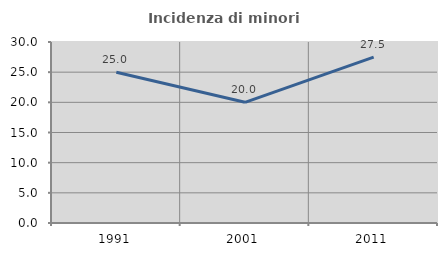
| Category | Incidenza di minori stranieri |
|---|---|
| 1991.0 | 25 |
| 2001.0 | 20 |
| 2011.0 | 27.491 |